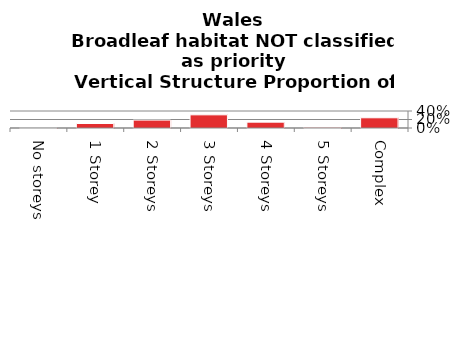
| Category | Broadleaf habitat NOT classified as priority |
|---|---|
| No storeys | 0.001 |
| 1 Storey | 0.106 |
| 2 Storeys | 0.186 |
| 3 Storeys | 0.31 |
| 4 Storeys | 0.138 |
| 5 Storeys | 0.019 |
| Complex | 0.24 |